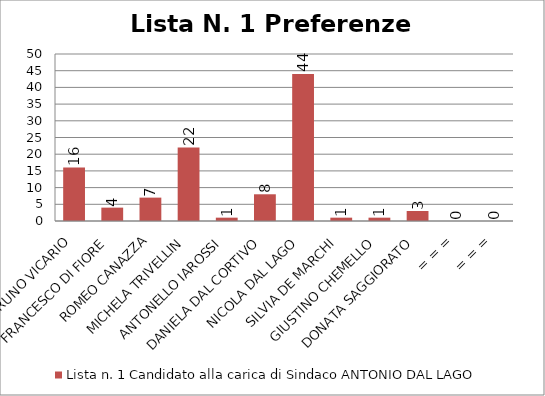
| Category | Lista n. 1 Candidato alla carica di Sindaco ANTONIO DAL LAGO |
|---|---|
| BRUNO VICARIO | 16 |
| FRANCESCO DI FIORE | 4 |
| ROMEO CANAZZA | 7 |
| MICHELA TRIVELLIN | 22 |
| ANTONELLO IAROSSI | 1 |
| DANIELA DAL CORTIVO | 8 |
| NICOLA DAL LAGO | 44 |
| SILVIA DE MARCHI | 1 |
| GIUSTINO CHEMELLO | 1 |
| DONATA SAGGIORATO | 3 |
| = = = | 0 |
| = = = | 0 |